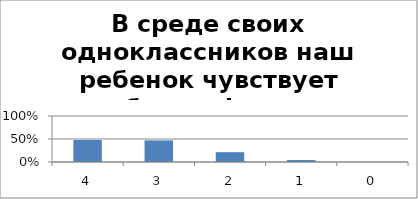
| Category | В среде своих одноклассников наш ребенок чувствует себя комфортно |
|---|---|
| 4.0 | 0.479 |
| 3.0 | 0.47 |
| 2.0 | 0.214 |
| 1.0 | 0.043 |
| 0.0 | 0 |